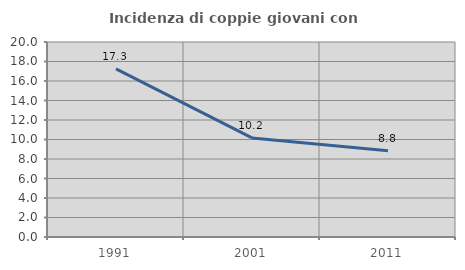
| Category | Incidenza di coppie giovani con figli |
|---|---|
| 1991.0 | 17.251 |
| 2001.0 | 10.165 |
| 2011.0 | 8.844 |